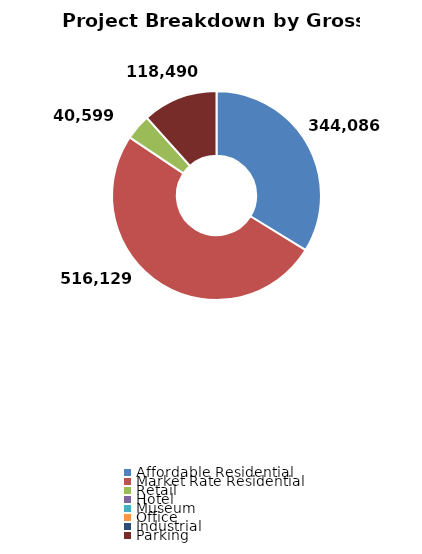
| Category | Series 0 |
|---|---|
| Affordable Residential | 344086 |
| Market Rate Residential | 516129 |
| Retail | 40599 |
| Hotel | 0 |
| Museum | 0 |
| Office | 0 |
| Industrial | 0 |
| Parking | 118490 |